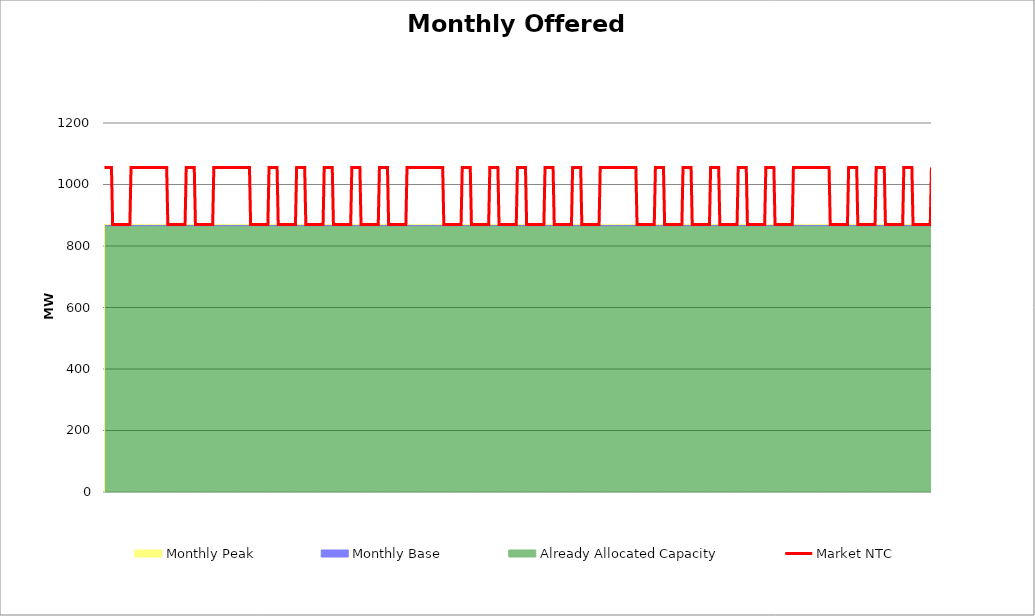
| Category | Market NTC |
|---|---|
| 0 | 1055 |
| 1 | 1055 |
| 2 | 1055 |
| 3 | 1055 |
| 4 | 1055 |
| 5 | 1055 |
| 6 | 1055 |
| 7 | 870 |
| 8 | 870 |
| 9 | 870 |
| 10 | 870 |
| 11 | 870 |
| 12 | 870 |
| 13 | 870 |
| 14 | 870 |
| 15 | 870 |
| 16 | 870 |
| 17 | 870 |
| 18 | 870 |
| 19 | 870 |
| 20 | 870 |
| 21 | 870 |
| 22 | 870 |
| 23 | 1055 |
| 24 | 1055 |
| 25 | 1055 |
| 26 | 1055 |
| 27 | 1055 |
| 28 | 1055 |
| 29 | 1055 |
| 30 | 1055 |
| 31 | 1055 |
| 32 | 1055 |
| 33 | 1055 |
| 34 | 1055 |
| 35 | 1055 |
| 36 | 1055 |
| 37 | 1055 |
| 38 | 1055 |
| 39 | 1055 |
| 40 | 1055 |
| 41 | 1055 |
| 42 | 1055 |
| 43 | 1055 |
| 44 | 1055 |
| 45 | 1055 |
| 46 | 1055 |
| 47 | 1055 |
| 48 | 1055 |
| 49 | 1055 |
| 50 | 1055 |
| 51 | 1055 |
| 52 | 1055 |
| 53 | 1055 |
| 54 | 1055 |
| 55 | 870 |
| 56 | 870 |
| 57 | 870 |
| 58 | 870 |
| 59 | 870 |
| 60 | 870 |
| 61 | 870 |
| 62 | 870 |
| 63 | 870 |
| 64 | 870 |
| 65 | 870 |
| 66 | 870 |
| 67 | 870 |
| 68 | 870 |
| 69 | 870 |
| 70 | 870 |
| 71 | 1055 |
| 72 | 1055 |
| 73 | 1055 |
| 74 | 1055 |
| 75 | 1055 |
| 76 | 1055 |
| 77 | 1055 |
| 78 | 1055 |
| 79 | 870 |
| 80 | 870 |
| 81 | 870 |
| 82 | 870 |
| 83 | 870 |
| 84 | 870 |
| 85 | 870 |
| 86 | 870 |
| 87 | 870 |
| 88 | 870 |
| 89 | 870 |
| 90 | 870 |
| 91 | 870 |
| 92 | 870 |
| 93 | 870 |
| 94 | 870 |
| 95 | 1055 |
| 96 | 1055 |
| 97 | 1055 |
| 98 | 1055 |
| 99 | 1055 |
| 100 | 1055 |
| 101 | 1055 |
| 102 | 1055 |
| 103 | 1055 |
| 104 | 1055 |
| 105 | 1055 |
| 106 | 1055 |
| 107 | 1055 |
| 108 | 1055 |
| 109 | 1055 |
| 110 | 1055 |
| 111 | 1055 |
| 112 | 1055 |
| 113 | 1055 |
| 114 | 1055 |
| 115 | 1055 |
| 116 | 1055 |
| 117 | 1055 |
| 118 | 1055 |
| 119 | 1055 |
| 120 | 1055 |
| 121 | 1055 |
| 122 | 1055 |
| 123 | 1055 |
| 124 | 1055 |
| 125 | 1055 |
| 126 | 1055 |
| 127 | 870 |
| 128 | 870 |
| 129 | 870 |
| 130 | 870 |
| 131 | 870 |
| 132 | 870 |
| 133 | 870 |
| 134 | 870 |
| 135 | 870 |
| 136 | 870 |
| 137 | 870 |
| 138 | 870 |
| 139 | 870 |
| 140 | 870 |
| 141 | 870 |
| 142 | 870 |
| 143 | 1055 |
| 144 | 1055 |
| 145 | 1055 |
| 146 | 1055 |
| 147 | 1055 |
| 148 | 1055 |
| 149 | 1055 |
| 150 | 1055 |
| 151 | 870 |
| 152 | 870 |
| 153 | 870 |
| 154 | 870 |
| 155 | 870 |
| 156 | 870 |
| 157 | 870 |
| 158 | 870 |
| 159 | 870 |
| 160 | 870 |
| 161 | 870 |
| 162 | 870 |
| 163 | 870 |
| 164 | 870 |
| 165 | 870 |
| 166 | 870 |
| 167 | 1055 |
| 168 | 1055 |
| 169 | 1055 |
| 170 | 1055 |
| 171 | 1055 |
| 172 | 1055 |
| 173 | 1055 |
| 174 | 1055 |
| 175 | 870 |
| 176 | 870 |
| 177 | 870 |
| 178 | 870 |
| 179 | 870 |
| 180 | 870 |
| 181 | 870 |
| 182 | 870 |
| 183 | 870 |
| 184 | 870 |
| 185 | 870 |
| 186 | 870 |
| 187 | 870 |
| 188 | 870 |
| 189 | 870 |
| 190 | 870 |
| 191 | 1055 |
| 192 | 1055 |
| 193 | 1055 |
| 194 | 1055 |
| 195 | 1055 |
| 196 | 1055 |
| 197 | 1055 |
| 198 | 1055 |
| 199 | 870 |
| 200 | 870 |
| 201 | 870 |
| 202 | 870 |
| 203 | 870 |
| 204 | 870 |
| 205 | 870 |
| 206 | 870 |
| 207 | 870 |
| 208 | 870 |
| 209 | 870 |
| 210 | 870 |
| 211 | 870 |
| 212 | 870 |
| 213 | 870 |
| 214 | 870 |
| 215 | 1055 |
| 216 | 1055 |
| 217 | 1055 |
| 218 | 1055 |
| 219 | 1055 |
| 220 | 1055 |
| 221 | 1055 |
| 222 | 1055 |
| 223 | 870 |
| 224 | 870 |
| 225 | 870 |
| 226 | 870 |
| 227 | 870 |
| 228 | 870 |
| 229 | 870 |
| 230 | 870 |
| 231 | 870 |
| 232 | 870 |
| 233 | 870 |
| 234 | 870 |
| 235 | 870 |
| 236 | 870 |
| 237 | 870 |
| 238 | 870 |
| 239 | 1055 |
| 240 | 1055 |
| 241 | 1055 |
| 242 | 1055 |
| 243 | 1055 |
| 244 | 1055 |
| 245 | 1055 |
| 246 | 1055 |
| 247 | 870 |
| 248 | 870 |
| 249 | 870 |
| 250 | 870 |
| 251 | 870 |
| 252 | 870 |
| 253 | 870 |
| 254 | 870 |
| 255 | 870 |
| 256 | 870 |
| 257 | 870 |
| 258 | 870 |
| 259 | 870 |
| 260 | 870 |
| 261 | 870 |
| 262 | 870 |
| 263 | 1055 |
| 264 | 1055 |
| 265 | 1055 |
| 266 | 1055 |
| 267 | 1055 |
| 268 | 1055 |
| 269 | 1055 |
| 270 | 1055 |
| 271 | 1055 |
| 272 | 1055 |
| 273 | 1055 |
| 274 | 1055 |
| 275 | 1055 |
| 276 | 1055 |
| 277 | 1055 |
| 278 | 1055 |
| 279 | 1055 |
| 280 | 1055 |
| 281 | 1055 |
| 282 | 1055 |
| 283 | 1055 |
| 284 | 1055 |
| 285 | 1055 |
| 286 | 1055 |
| 287 | 1055 |
| 288 | 1055 |
| 289 | 1055 |
| 290 | 1055 |
| 291 | 1055 |
| 292 | 1055 |
| 293 | 1055 |
| 294 | 1055 |
| 295 | 870 |
| 296 | 870 |
| 297 | 870 |
| 298 | 870 |
| 299 | 870 |
| 300 | 870 |
| 301 | 870 |
| 302 | 870 |
| 303 | 870 |
| 304 | 870 |
| 305 | 870 |
| 306 | 870 |
| 307 | 870 |
| 308 | 870 |
| 309 | 870 |
| 310 | 870 |
| 311 | 1055 |
| 312 | 1055 |
| 313 | 1055 |
| 314 | 1055 |
| 315 | 1055 |
| 316 | 1055 |
| 317 | 1055 |
| 318 | 1055 |
| 319 | 870 |
| 320 | 870 |
| 321 | 870 |
| 322 | 870 |
| 323 | 870 |
| 324 | 870 |
| 325 | 870 |
| 326 | 870 |
| 327 | 870 |
| 328 | 870 |
| 329 | 870 |
| 330 | 870 |
| 331 | 870 |
| 332 | 870 |
| 333 | 870 |
| 334 | 870 |
| 335 | 1055 |
| 336 | 1055 |
| 337 | 1055 |
| 338 | 1055 |
| 339 | 1055 |
| 340 | 1055 |
| 341 | 1055 |
| 342 | 1055 |
| 343 | 870 |
| 344 | 870 |
| 345 | 870 |
| 346 | 870 |
| 347 | 870 |
| 348 | 870 |
| 349 | 870 |
| 350 | 870 |
| 351 | 870 |
| 352 | 870 |
| 353 | 870 |
| 354 | 870 |
| 355 | 870 |
| 356 | 870 |
| 357 | 870 |
| 358 | 870 |
| 359 | 1055 |
| 360 | 1055 |
| 361 | 1055 |
| 362 | 1055 |
| 363 | 1055 |
| 364 | 1055 |
| 365 | 1055 |
| 366 | 1055 |
| 367 | 870 |
| 368 | 870 |
| 369 | 870 |
| 370 | 870 |
| 371 | 870 |
| 372 | 870 |
| 373 | 870 |
| 374 | 870 |
| 375 | 870 |
| 376 | 870 |
| 377 | 870 |
| 378 | 870 |
| 379 | 870 |
| 380 | 870 |
| 381 | 870 |
| 382 | 870 |
| 383 | 1055 |
| 384 | 1055 |
| 385 | 1055 |
| 386 | 1055 |
| 387 | 1055 |
| 388 | 1055 |
| 389 | 1055 |
| 390 | 1055 |
| 391 | 870 |
| 392 | 870 |
| 393 | 870 |
| 394 | 870 |
| 395 | 870 |
| 396 | 870 |
| 397 | 870 |
| 398 | 870 |
| 399 | 870 |
| 400 | 870 |
| 401 | 870 |
| 402 | 870 |
| 403 | 870 |
| 404 | 870 |
| 405 | 870 |
| 406 | 870 |
| 407 | 1055 |
| 408 | 1055 |
| 409 | 1055 |
| 410 | 1055 |
| 411 | 1055 |
| 412 | 1055 |
| 413 | 1055 |
| 414 | 1055 |
| 415 | 870 |
| 416 | 870 |
| 417 | 870 |
| 418 | 870 |
| 419 | 870 |
| 420 | 870 |
| 421 | 870 |
| 422 | 870 |
| 423 | 870 |
| 424 | 870 |
| 425 | 870 |
| 426 | 870 |
| 427 | 870 |
| 428 | 870 |
| 429 | 870 |
| 430 | 870 |
| 431 | 1055 |
| 432 | 1055 |
| 433 | 1055 |
| 434 | 1055 |
| 435 | 1055 |
| 436 | 1055 |
| 437 | 1055 |
| 438 | 1055 |
| 439 | 1055 |
| 440 | 1055 |
| 441 | 1055 |
| 442 | 1055 |
| 443 | 1055 |
| 444 | 1055 |
| 445 | 1055 |
| 446 | 1055 |
| 447 | 1055 |
| 448 | 1055 |
| 449 | 1055 |
| 450 | 1055 |
| 451 | 1055 |
| 452 | 1055 |
| 453 | 1055 |
| 454 | 1055 |
| 455 | 1055 |
| 456 | 1055 |
| 457 | 1055 |
| 458 | 1055 |
| 459 | 1055 |
| 460 | 1055 |
| 461 | 1055 |
| 462 | 1055 |
| 463 | 870 |
| 464 | 870 |
| 465 | 870 |
| 466 | 870 |
| 467 | 870 |
| 468 | 870 |
| 469 | 870 |
| 470 | 870 |
| 471 | 870 |
| 472 | 870 |
| 473 | 870 |
| 474 | 870 |
| 475 | 870 |
| 476 | 870 |
| 477 | 870 |
| 478 | 870 |
| 479 | 1055 |
| 480 | 1055 |
| 481 | 1055 |
| 482 | 1055 |
| 483 | 1055 |
| 484 | 1055 |
| 485 | 1055 |
| 486 | 1055 |
| 487 | 870 |
| 488 | 870 |
| 489 | 870 |
| 490 | 870 |
| 491 | 870 |
| 492 | 870 |
| 493 | 870 |
| 494 | 870 |
| 495 | 870 |
| 496 | 870 |
| 497 | 870 |
| 498 | 870 |
| 499 | 870 |
| 500 | 870 |
| 501 | 870 |
| 502 | 870 |
| 503 | 1055 |
| 504 | 1055 |
| 505 | 1055 |
| 506 | 1055 |
| 507 | 1055 |
| 508 | 1055 |
| 509 | 1055 |
| 510 | 1055 |
| 511 | 870 |
| 512 | 870 |
| 513 | 870 |
| 514 | 870 |
| 515 | 870 |
| 516 | 870 |
| 517 | 870 |
| 518 | 870 |
| 519 | 870 |
| 520 | 870 |
| 521 | 870 |
| 522 | 870 |
| 523 | 870 |
| 524 | 870 |
| 525 | 870 |
| 526 | 870 |
| 527 | 1055 |
| 528 | 1055 |
| 529 | 1055 |
| 530 | 1055 |
| 531 | 1055 |
| 532 | 1055 |
| 533 | 1055 |
| 534 | 1055 |
| 535 | 870 |
| 536 | 870 |
| 537 | 870 |
| 538 | 870 |
| 539 | 870 |
| 540 | 870 |
| 541 | 870 |
| 542 | 870 |
| 543 | 870 |
| 544 | 870 |
| 545 | 870 |
| 546 | 870 |
| 547 | 870 |
| 548 | 870 |
| 549 | 870 |
| 550 | 870 |
| 551 | 1055 |
| 552 | 1055 |
| 553 | 1055 |
| 554 | 1055 |
| 555 | 1055 |
| 556 | 1055 |
| 557 | 1055 |
| 558 | 1055 |
| 559 | 870 |
| 560 | 870 |
| 561 | 870 |
| 562 | 870 |
| 563 | 870 |
| 564 | 870 |
| 565 | 870 |
| 566 | 870 |
| 567 | 870 |
| 568 | 870 |
| 569 | 870 |
| 570 | 870 |
| 571 | 870 |
| 572 | 870 |
| 573 | 870 |
| 574 | 870 |
| 575 | 1055 |
| 576 | 1055 |
| 577 | 1055 |
| 578 | 1055 |
| 579 | 1055 |
| 580 | 1055 |
| 581 | 1055 |
| 582 | 1055 |
| 583 | 870 |
| 584 | 870 |
| 585 | 870 |
| 586 | 870 |
| 587 | 870 |
| 588 | 870 |
| 589 | 870 |
| 590 | 870 |
| 591 | 870 |
| 592 | 870 |
| 593 | 870 |
| 594 | 870 |
| 595 | 870 |
| 596 | 870 |
| 597 | 870 |
| 598 | 870 |
| 599 | 1055 |
| 600 | 1055 |
| 601 | 1055 |
| 602 | 1055 |
| 603 | 1055 |
| 604 | 1055 |
| 605 | 1055 |
| 606 | 1055 |
| 607 | 1055 |
| 608 | 1055 |
| 609 | 1055 |
| 610 | 1055 |
| 611 | 1055 |
| 612 | 1055 |
| 613 | 1055 |
| 614 | 1055 |
| 615 | 1055 |
| 616 | 1055 |
| 617 | 1055 |
| 618 | 1055 |
| 619 | 1055 |
| 620 | 1055 |
| 621 | 1055 |
| 622 | 1055 |
| 623 | 1055 |
| 624 | 1055 |
| 625 | 1055 |
| 626 | 1055 |
| 627 | 1055 |
| 628 | 1055 |
| 629 | 1055 |
| 630 | 1055 |
| 631 | 870 |
| 632 | 870 |
| 633 | 870 |
| 634 | 870 |
| 635 | 870 |
| 636 | 870 |
| 637 | 870 |
| 638 | 870 |
| 639 | 870 |
| 640 | 870 |
| 641 | 870 |
| 642 | 870 |
| 643 | 870 |
| 644 | 870 |
| 645 | 870 |
| 646 | 870 |
| 647 | 1055 |
| 648 | 1055 |
| 649 | 1055 |
| 650 | 1055 |
| 651 | 1055 |
| 652 | 1055 |
| 653 | 1055 |
| 654 | 1055 |
| 655 | 870 |
| 656 | 870 |
| 657 | 870 |
| 658 | 870 |
| 659 | 870 |
| 660 | 870 |
| 661 | 870 |
| 662 | 870 |
| 663 | 870 |
| 664 | 870 |
| 665 | 870 |
| 666 | 870 |
| 667 | 870 |
| 668 | 870 |
| 669 | 870 |
| 670 | 870 |
| 671 | 1055 |
| 672 | 1055 |
| 673 | 1055 |
| 674 | 1055 |
| 675 | 1055 |
| 676 | 1055 |
| 677 | 1055 |
| 678 | 1055 |
| 679 | 870 |
| 680 | 870 |
| 681 | 870 |
| 682 | 870 |
| 683 | 870 |
| 684 | 870 |
| 685 | 870 |
| 686 | 870 |
| 687 | 870 |
| 688 | 870 |
| 689 | 870 |
| 690 | 870 |
| 691 | 870 |
| 692 | 870 |
| 693 | 870 |
| 694 | 870 |
| 695 | 1055 |
| 696 | 1055 |
| 697 | 1055 |
| 698 | 1055 |
| 699 | 1055 |
| 700 | 1055 |
| 701 | 1055 |
| 702 | 1055 |
| 703 | 870 |
| 704 | 870 |
| 705 | 870 |
| 706 | 870 |
| 707 | 870 |
| 708 | 870 |
| 709 | 870 |
| 710 | 870 |
| 711 | 870 |
| 712 | 870 |
| 713 | 870 |
| 714 | 870 |
| 715 | 870 |
| 716 | 870 |
| 717 | 870 |
| 718 | 870 |
| 719 | 1055 |